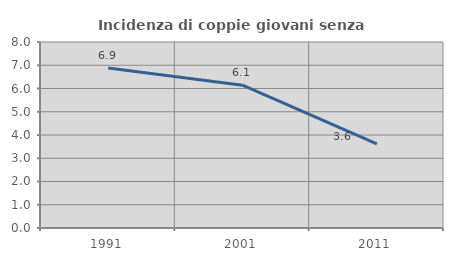
| Category | Incidenza di coppie giovani senza figli |
|---|---|
| 1991.0 | 6.882 |
| 2001.0 | 6.143 |
| 2011.0 | 3.62 |